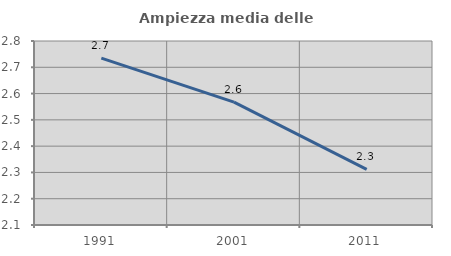
| Category | Ampiezza media delle famiglie |
|---|---|
| 1991.0 | 2.735 |
| 2001.0 | 2.567 |
| 2011.0 | 2.312 |